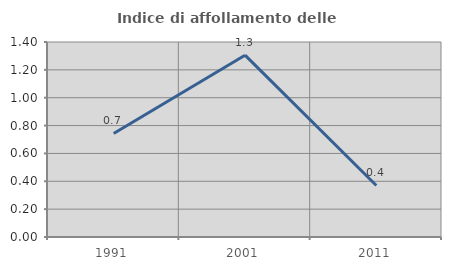
| Category | Indice di affollamento delle abitazioni  |
|---|---|
| 1991.0 | 0.743 |
| 2001.0 | 1.305 |
| 2011.0 | 0.37 |